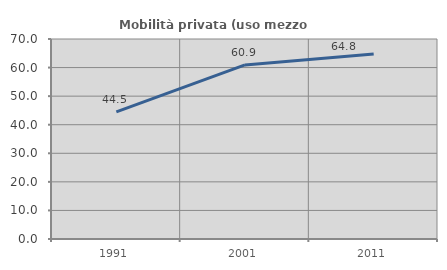
| Category | Mobilità privata (uso mezzo privato) |
|---|---|
| 1991.0 | 44.463 |
| 2001.0 | 60.936 |
| 2011.0 | 64.774 |